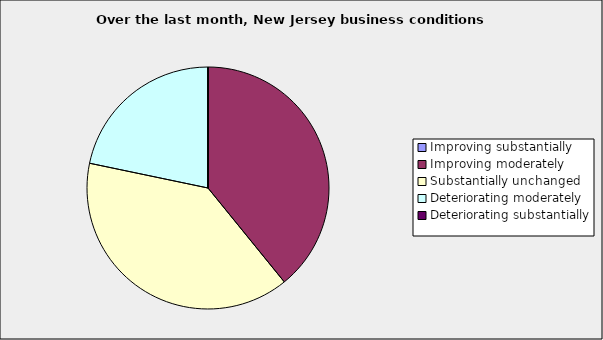
| Category | Series 0 |
|---|---|
| Improving substantially | 0 |
| Improving moderately | 0.391 |
| Substantially unchanged | 0.391 |
| Deteriorating moderately | 0.217 |
| Deteriorating substantially | 0 |